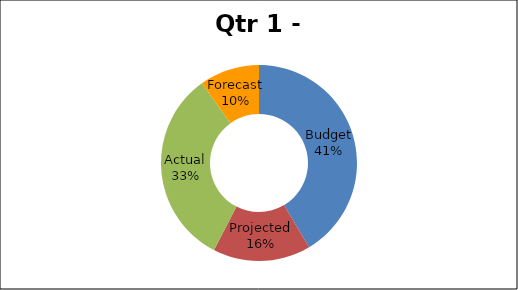
| Category | Series 0 |
|---|---|
| Budget | 3060 |
| Projected | 1190 |
| Actual | 2400 |
| Forecast | 730 |